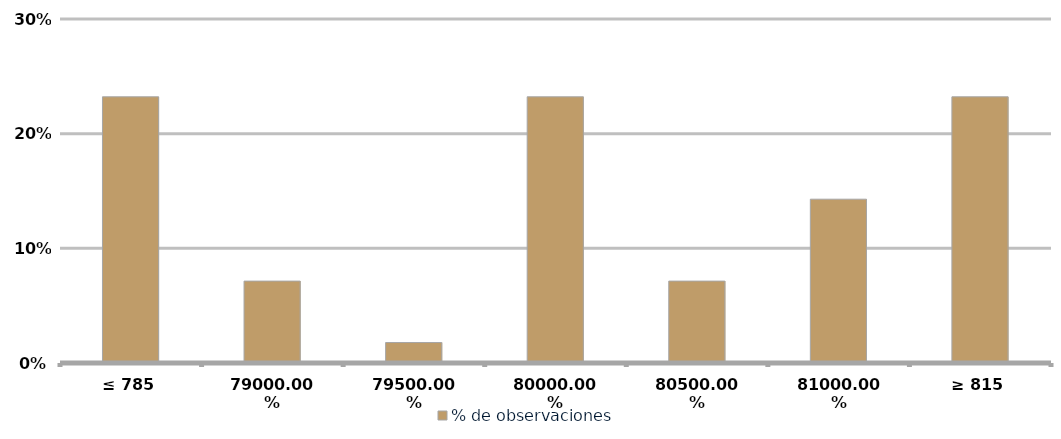
| Category | % de observaciones  |
|---|---|
| ≤ 785 | 0.232 |
| 790 | 0.071 |
| 795 | 0.018 |
| 800 | 0.232 |
| 805 | 0.071 |
| 810 | 0.143 |
| ≥ 815 | 0.232 |